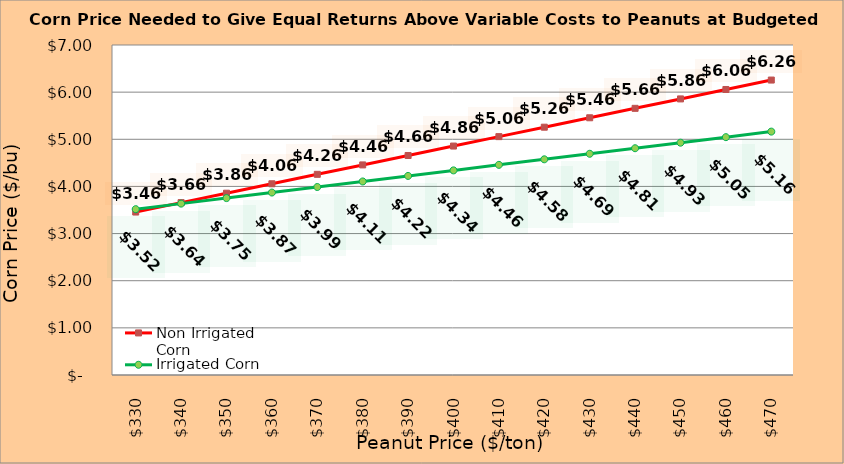
| Category | Non Irrigated Corn | Irrigated Corn |
|---|---|---|
| 330.0 | 3.456 | 3.518 |
| 340.0 | 3.656 | 3.635 |
| 350.0 | 3.856 | 3.753 |
| 360.0 | 4.056 | 3.87 |
| 370.0 | 4.256 | 3.988 |
| 380.0 | 4.456 | 4.105 |
| 390.0 | 4.656 | 4.223 |
| 400.0 | 4.856 | 4.34 |
| 410.0 | 5.056 | 4.458 |
| 420.0 | 5.256 | 4.575 |
| 430.0 | 5.456 | 4.693 |
| 440.0 | 5.656 | 4.81 |
| 450.0 | 5.856 | 4.928 |
| 460.0 | 6.056 | 5.045 |
| 470.0 | 6.256 | 5.163 |